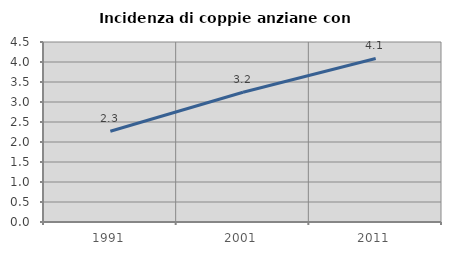
| Category | Incidenza di coppie anziane con figli |
|---|---|
| 1991.0 | 2.268 |
| 2001.0 | 3.244 |
| 2011.0 | 4.088 |